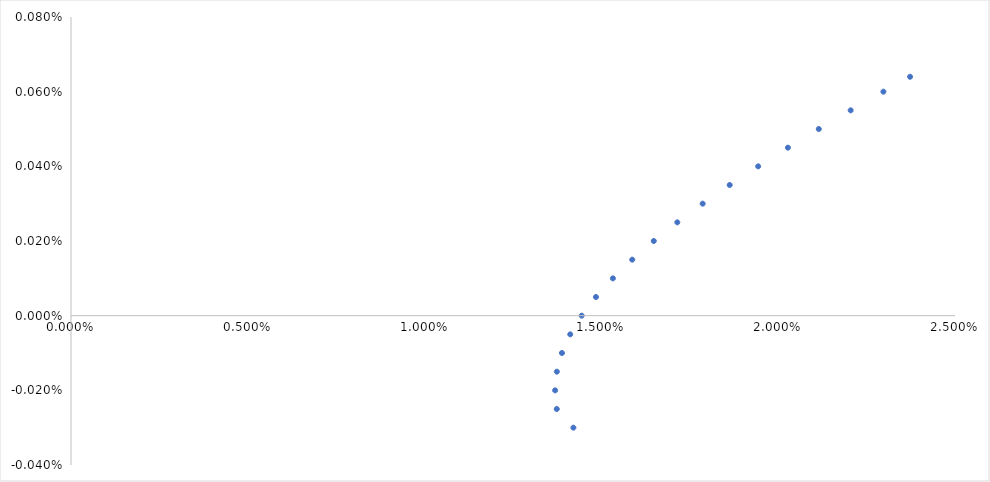
| Category | Rent. Portaf |
|---|---|
| 0.014207961434050334 | 0 |
| 0.013737593564501067 | 0 |
| 0.013691134714793551 | 0 |
| 0.013740249152143724 | 0 |
| 0.013883922773177378 | 0 |
| 0.014119269775526444 | 0 |
| 0.014441807408928968 | 0 |
| 0.014845855514588904 | 0 |
| 0.015324967785609303 | 0 |
| 0.015872348158746913 | 0 |
| 0.01648122984241944 | 0 |
| 0.01714657417214465 | 0 |
| 0.0178641128209255 | 0 |
| 0.018628212032830983 | 0 |
| 0.01943338038377758 | 0 |
| 0.020274725599163608 | 0 |
| 0.02114792238931913 | 0.001 |
| 0.02204920980067985 | 0.001 |
| 0.022975260232121122 | 0.001 |
| 0.02372920269477008 | 0.001 |